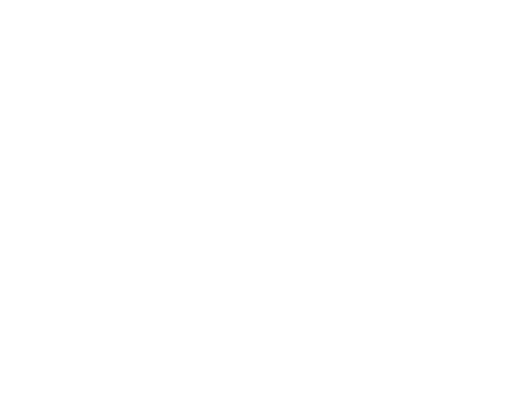
| Category | Series 0 | Series 1 | Series 2 |
|---|---|---|---|
| Impuestos | 825541.1 | 0.04 |  |
| Cuotas y Aportaciones de Seguridad Social | 0 | 0 |  |
| Contribuciones de Mejoras | 3105 | 0 |  |
| Derechos | 59747.65 | 0.003 |  |
| Productos | 0 | 0 |  |
| Aprovechamientos | 55398.72 | 0.003 |  |
| Ingresos por Ventas de Bienes y Servicios | 0 | 0 |  |
| Participaciones y Aportaciones | 19946100.51 | 0.955 |  |
| Transferencias, Asignaciones, Subsidios y Otras Ayudas | 0 | 0 |  |
| Ingresos Derivados de Financiamientos | 0 | 0 |  |